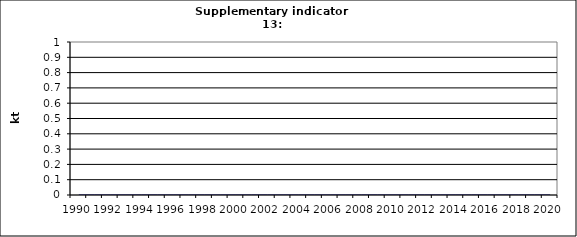
| Category | Physical output of paper, kt |
|---|---|
| 1990 | 0 |
| 1991 | 0 |
| 1992 | 0 |
| 1993 | 0 |
| 1994 | 0 |
| 1995 | 0 |
| 1996 | 0 |
| 1997 | 0 |
| 1998 | 0 |
| 1999 | 0 |
| 2000 | 0 |
| 2001 | 0 |
| 2002 | 0 |
| 2003 | 0 |
| 2004 | 0 |
| 2005 | 0 |
| 2006 | 0 |
| 2007 | 0 |
| 2008 | 0 |
| 2009 | 0 |
| 2010 | 0 |
| 2011 | 0 |
| 2012 | 0 |
| 2013 | 0 |
| 2014 | 0 |
| 2015 | 0 |
| 2016 | 0 |
| 2017 | 0 |
| 2018 | 0 |
| 2019 | 0 |
| 2020 | 0 |